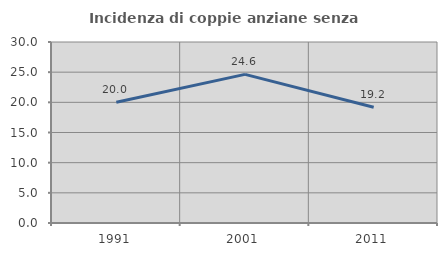
| Category | Incidenza di coppie anziane senza figli  |
|---|---|
| 1991.0 | 20 |
| 2001.0 | 24.638 |
| 2011.0 | 19.178 |